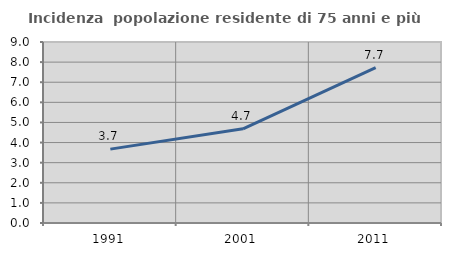
| Category | Incidenza  popolazione residente di 75 anni e più |
|---|---|
| 1991.0 | 3.674 |
| 2001.0 | 4.685 |
| 2011.0 | 7.728 |